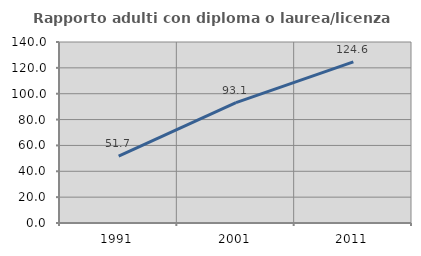
| Category | Rapporto adulti con diploma o laurea/licenza media  |
|---|---|
| 1991.0 | 51.667 |
| 2001.0 | 93.146 |
| 2011.0 | 124.633 |